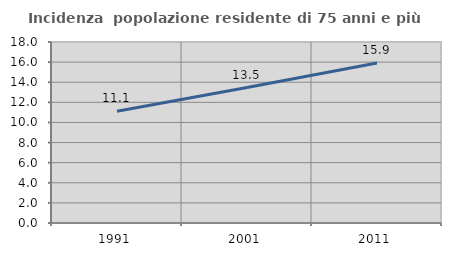
| Category | Incidenza  popolazione residente di 75 anni e più |
|---|---|
| 1991.0 | 11.105 |
| 2001.0 | 13.473 |
| 2011.0 | 15.919 |